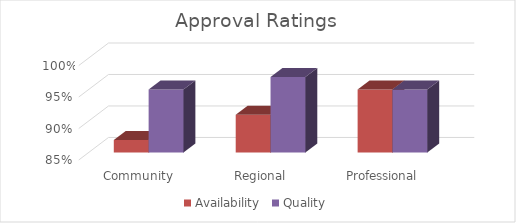
| Category | Availability | Quality |
|---|---|---|
| Community | 0.87 | 0.95 |
| Regional | 0.91 | 0.97 |
| Professional | 0.95 | 0.95 |